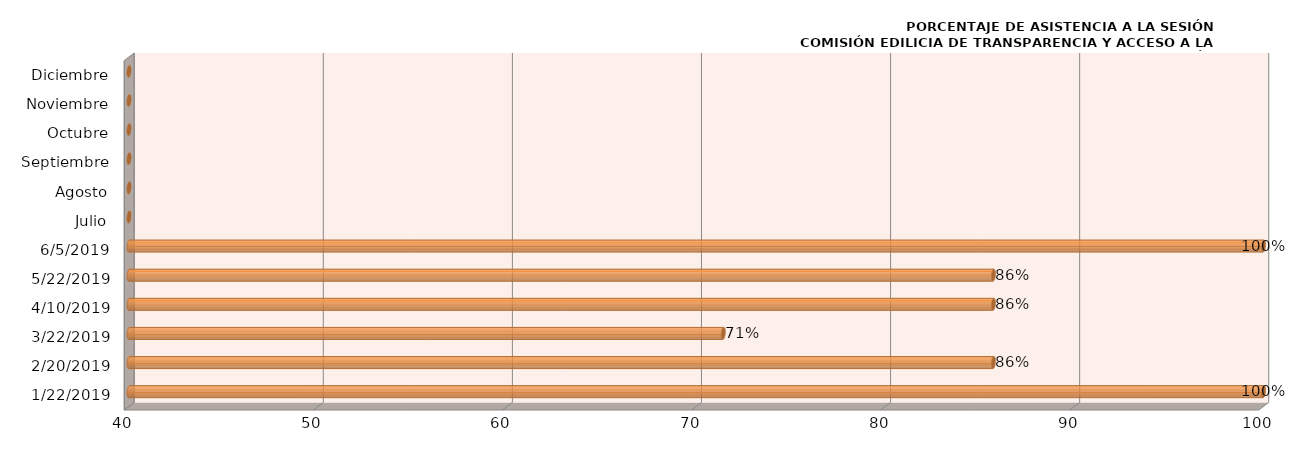
| Category | Series 0 |
|---|---|
| 22/01/2019 | 100 |
| 20/02/2019 | 85.714 |
| 22/03/2019 | 71.429 |
| 10/04/2019 | 85.714 |
| 22/05/2019 | 85.714 |
| 05/06/2019 | 100 |
| Julio | 0 |
| Agosto | 0 |
| Septiembre | 0 |
| Octubre | 0 |
| Noviembre | 0 |
| Diciembre | 0 |